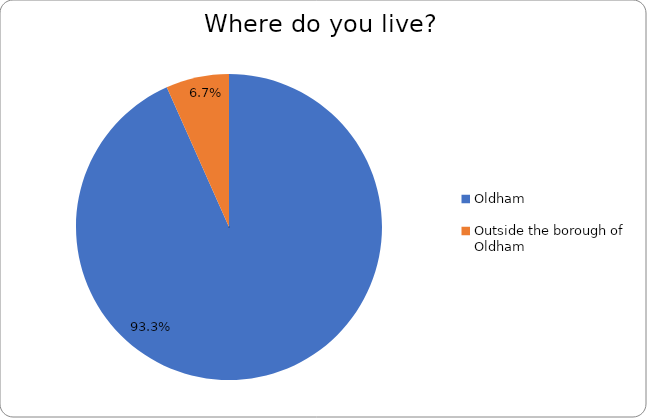
| Category | Series 0 |
|---|---|
| Oldham | 0.933 |
| Outside the borough of Oldham | 0.067 |